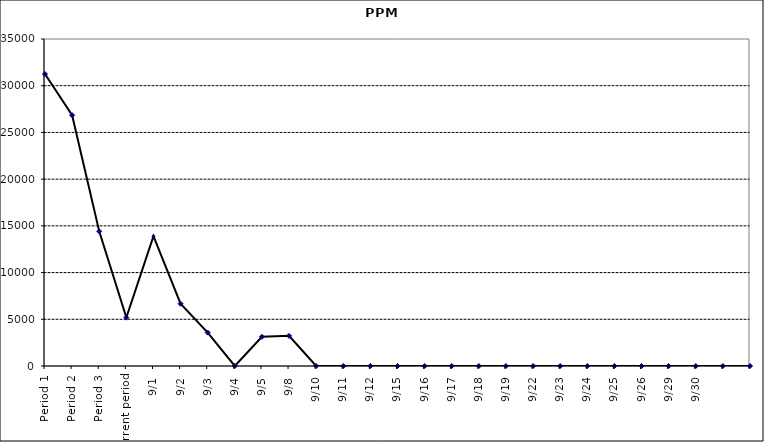
| Category | Series 0 |
|---|---|
| Period 1 | 31250 |
| Period 2 | 26849.315 |
| Period 3 | 14411.765 |
| current period | 5181.347 |
| 9/1 | 13888.889 |
| 9/2 | 6666.667 |
| 9/3 | 3571.429 |
| 9/4 | 0 |
| 9/5 | 3125 |
| 9/8 | 3225.806 |
| 9/10 | 0 |
| 9/11 | 0 |
| 9/12 | 0 |
| 9/15 | 0 |
| 9/16 | 0 |
| 9/17 | 0 |
| 9/18 | 0 |
| 9/19 | 0 |
| 9/22 | 0 |
| 9/23 | 0 |
| 9/24 | 0 |
| 9/25 | 0 |
| 9/26 | 0 |
| 9/29 | 0 |
| 9/30 | 0 |